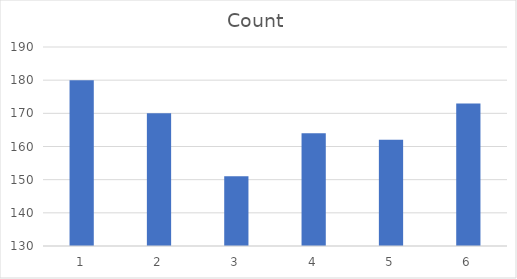
| Category | Count |
|---|---|
| 1.0 | 180 |
| 2.0 | 170 |
| 3.0 | 151 |
| 4.0 | 164 |
| 5.0 | 162 |
| 6.0 | 173 |